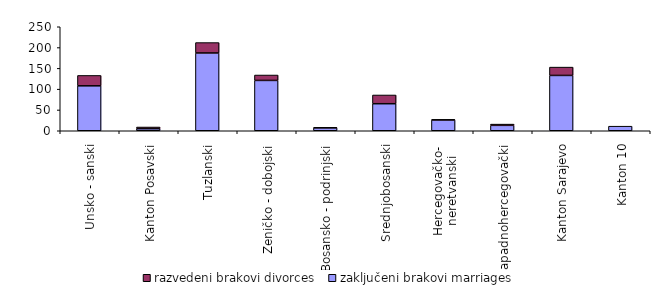
| Category | zaključeni brakovi marriages | razvedeni brakovi divorces |
|---|---|---|
| Unsko - sanski | 108 | 25 |
| Kanton Posavski | 5 | 4 |
| Tuzlanski | 187 | 25 |
| Zeničko - dobojski | 121 | 13 |
| Bosansko - podrinjski | 7 | 1 |
| Srednjobosanski | 65 | 21 |
| Hercegovačko-
neretvanski | 26 | 1 |
| Zapadnohercegovački | 13 | 3 |
| Kanton Sarajevo | 133 | 20 |
| Kanton 10 | 11 | 0 |